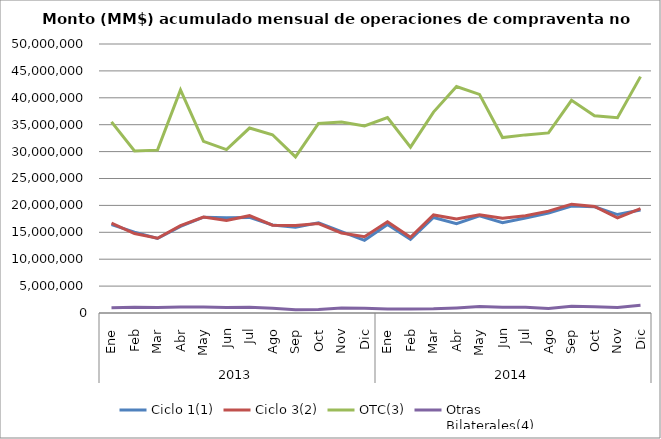
| Category | Ciclo 1(1) | Ciclo 3(2) | OTC(3) | Otras
Bilaterales(4) |
|---|---|---|---|---|
| 0 | 16417241.727 | 16700335.202 | 35523809.408 | 972958.086 |
| 1 | 15037741.172 | 14773657.586 | 30102338.851 | 1073496.596 |
| 2 | 13848943.779 | 13900402.205 | 30273669.122 | 1026617.054 |
| 3 | 16086096.035 | 16245696.168 | 41465554.082 | 1105720.368 |
| 4 | 17801790.619 | 17838763.351 | 31909646.654 | 1133512.85 |
| 5 | 17684542.956 | 17179330.609 | 30372188.279 | 1025162.543 |
| 6 | 17771623.451 | 18089502.524 | 34376831.202 | 1053340.718 |
| 7 | 16359818.954 | 16327115.519 | 33128143.288 | 882723.558 |
| 8 | 15949862.744 | 16281684.387 | 29025705.039 | 624893.462 |
| 9 | 16760948.703 | 16634867.291 | 35234004.542 | 641647.876 |
| 10 | 15133528.556 | 14863555.208 | 35512550.02 | 915020.525 |
| 11 | 13509827.678 | 14192849.668 | 34769513.126 | 877765.247 |
| 12 | 16434121.823 | 16973216.875 | 36341658.718 | 750147.378 |
| 13 | 13675521.943 | 14060199.134 | 30828680.35 | 721919.806 |
| 14 | 17760484.117 | 18231676.991 | 37344676.439 | 768460.999 |
| 15 | 16615436.994 | 17468955.339 | 42094978.158 | 945494.284 |
| 16 | 18046213.572 | 18258193.447 | 40638812.154 | 1185202.419 |
| 17 | 16777760.924 | 17604169.829 | 32614242.011 | 1051618.708 |
| 18 | 17653207.737 | 18067976.125 | 33107498.911 | 1069963.521 |
| 19 | 18582577.233 | 18927801.519 | 33476806.263 | 855141.972 |
| 20 | 19897365.776 | 20231545.747 | 39538700.233 | 1232916.988 |
| 21 | 19756659.053 | 19803460.861 | 36676651.963 | 1179870.422 |
| 22 | 18299330.053 | 17675235.227 | 36300332.383 | 1017648.294 |
| 23 | 19142679.088 | 19412117.224 | 43938819.026 | 1420074.467 |